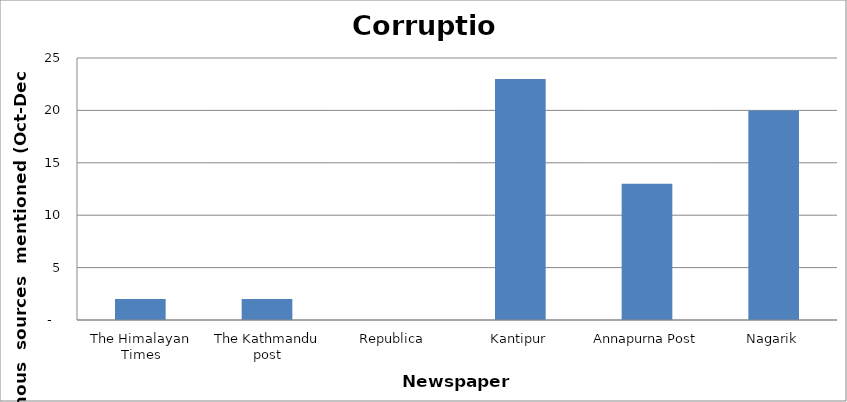
| Category | Corruption |
|---|---|
| The Himalayan Times | 2 |
| The Kathmandu post | 2 |
| Republica | 0 |
| Kantipur | 23 |
| Annapurna Post | 13 |
| Nagarik | 20 |